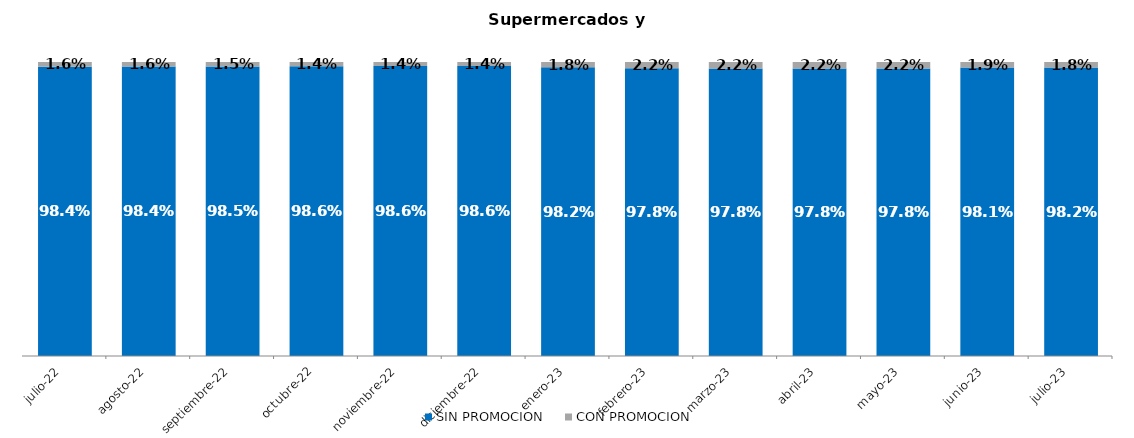
| Category | SIN PROMOCION   | CON PROMOCION   |
|---|---|---|
| 2022-07-01 | 0.984 | 0.016 |
| 2022-08-01 | 0.984 | 0.016 |
| 2022-09-01 | 0.985 | 0.015 |
| 2022-10-01 | 0.986 | 0.014 |
| 2022-11-01 | 0.986 | 0.014 |
| 2022-12-01 | 0.986 | 0.014 |
| 2023-01-01 | 0.982 | 0.018 |
| 2023-02-01 | 0.978 | 0.022 |
| 2023-03-01 | 0.978 | 0.022 |
| 2023-04-01 | 0.978 | 0.022 |
| 2023-05-01 | 0.978 | 0.022 |
| 2023-06-01 | 0.981 | 0.019 |
| 2023-07-01 | 0.982 | 0.018 |